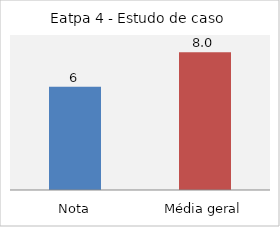
| Category | Eatpa 4 - Estudo de caso |
|---|---|
| Nota | 6 |
| Média geral | 8 |